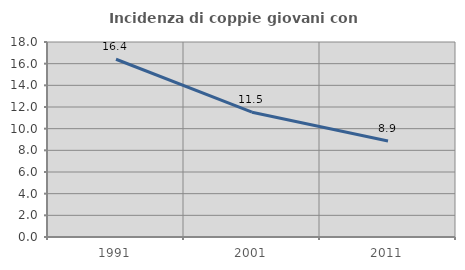
| Category | Incidenza di coppie giovani con figli |
|---|---|
| 1991.0 | 16.406 |
| 2001.0 | 11.523 |
| 2011.0 | 8.861 |